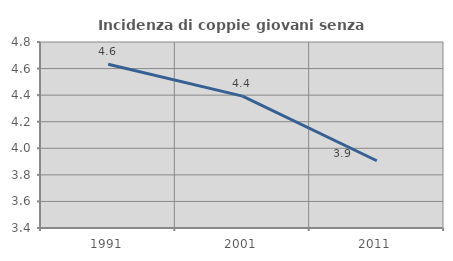
| Category | Incidenza di coppie giovani senza figli |
|---|---|
| 1991.0 | 4.632 |
| 2001.0 | 4.393 |
| 2011.0 | 3.906 |